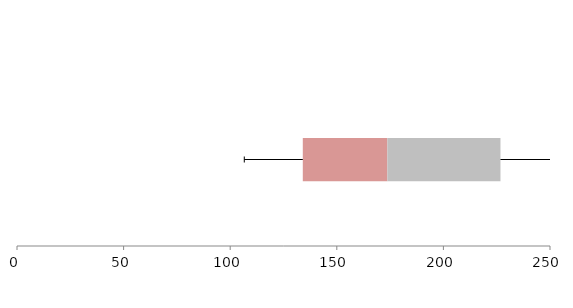
| Category | Series 1 | Series 2 | Series 3 |
|---|---|---|---|
| 0 | 134.052 | 39.67 | 53.045 |